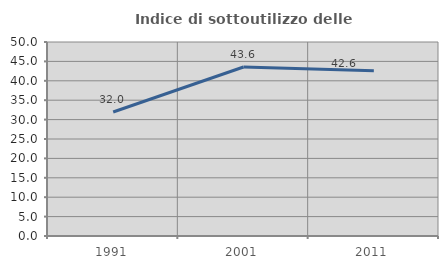
| Category | Indice di sottoutilizzo delle abitazioni  |
|---|---|
| 1991.0 | 31.957 |
| 2001.0 | 43.567 |
| 2011.0 | 42.619 |